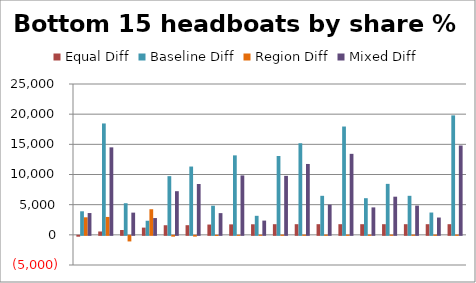
| Category | Equal Diff | Baseline Diff | Region Diff | Mixed Diff |
|---|---|---|---|---|
| 0 | -142.96 | 3901.04 | 2904.04 | 3613.04 |
| 1 | 556.146 | 18460.146 | 2965.146 | 14499.146 |
| 2 | 798.728 | 5238.728 | -928.272 | 3679.728 |
| 3 | 1196.292 | 2336.292 | 4243.292 | 2782.292 |
| 4 | 1590.487 | 9726.487 | -136.513 | 7233.487 |
| 5 | 1598.91 | 11318.91 | -128.09 | 8425.91 |
| 6 | 1705.039 | 4825.039 | -21.961 | 3600.039 |
| 7 | 1735.362 | 13171.362 | 8.362 | 9845.362 |
| 8 | 1748.839 | 3152.839 | 21.839 | 2360.839 |
| 9 | 1764 | 13068 | 37 | 9775 |
| 10 | 1765 | 15180 | 37 | 11746 |
| 11 | 1766 | 6468 | 37 | 5010 |
| 12 | 1764 | 17952 | 37 | 13425 |
| 13 | 1764 | 6072 | 37 | 4547 |
| 14 | 1764 | 8448 | 37 | 6322 |
| 15 | 1764 | 6468 | 37 | 4843 |
| 16 | 1764 | 3696 | 37 | 2867 |
| 17 | 1764 | 19800 | 37 | 14806 |